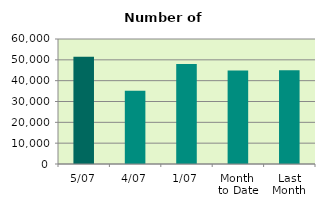
| Category | Series 0 |
|---|---|
| 5/07 | 51434 |
| 4/07 | 35160 |
| 1/07 | 47952 |
| Month 
to Date | 44848.667 |
| Last
Month | 45009.909 |